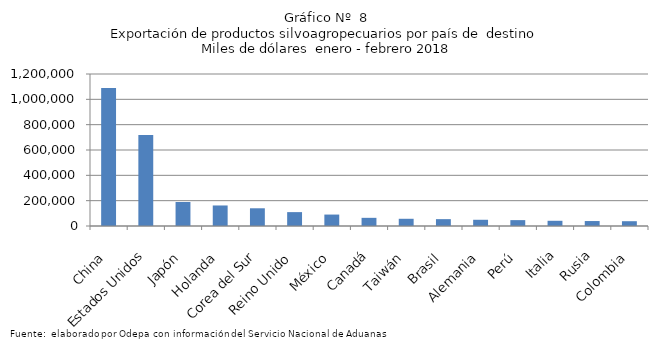
| Category | Series 0 |
|---|---|
| China | 1089724.124 |
| Estados Unidos | 717518.728 |
| Japón | 189665.44 |
| Holanda | 162069.206 |
| Corea del Sur | 139899.933 |
| Reino Unido | 109583.249 |
| México | 90287.283 |
| Canadá | 64460.951 |
| Taiwán | 56984.128 |
| Brasil | 54148.703 |
| Alemania | 49112.34 |
| Perú | 46379.386 |
| Italia | 41138.951 |
| Rusia | 39175.858 |
| Colombia | 37881.19 |